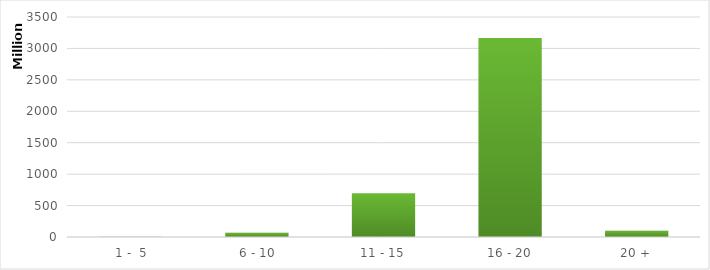
| Category | Series 0 |
|---|---|
|  1 -  5 | 5126108.611 |
|  6 - 10 | 67659299.337 |
| 11 - 15 | 694144643.791 |
| 16 - 20 | 3166663813.204 |
| 20 + | 101267238.437 |